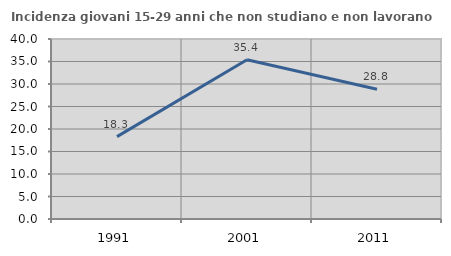
| Category | Incidenza giovani 15-29 anni che non studiano e non lavorano  |
|---|---|
| 1991.0 | 18.31 |
| 2001.0 | 35.387 |
| 2011.0 | 28.823 |